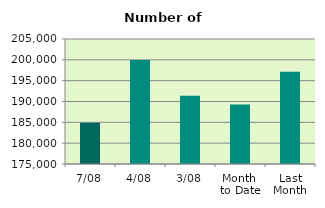
| Category | Series 0 |
|---|---|
| 7/08 | 184888 |
| 4/08 | 199970 |
| 3/08 | 191380 |
| Month 
to Date | 189258 |
| Last
Month | 197154.286 |